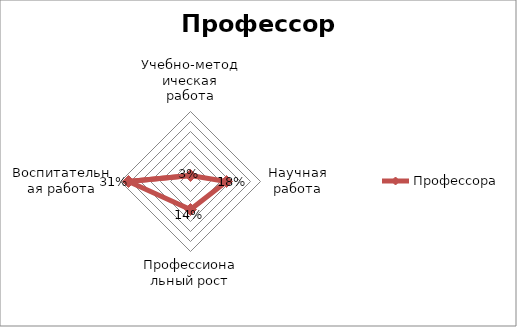
| Category | Профессора |
|---|---|
| Учебно-методическая работа | 0.03 |
| Научная работа | 0.18 |
| Профессиональный рост | 0.14 |
| Воспитательная работа | 0.31 |